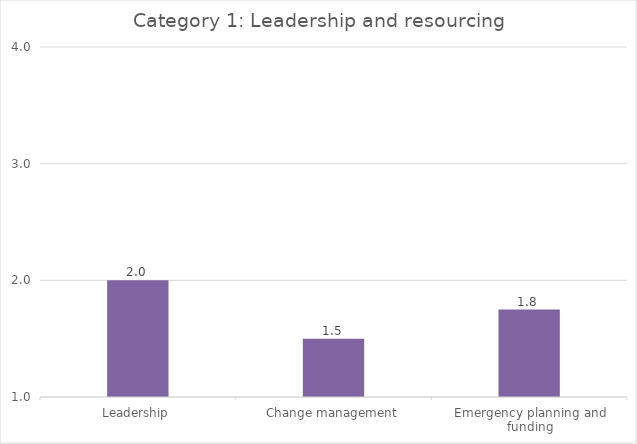
| Category |   Category 1: Leadership and resourcing |
|---|---|
| Leadership | 2 |
| Change management | 1.5 |
| Emergency planning and funding | 1.75 |